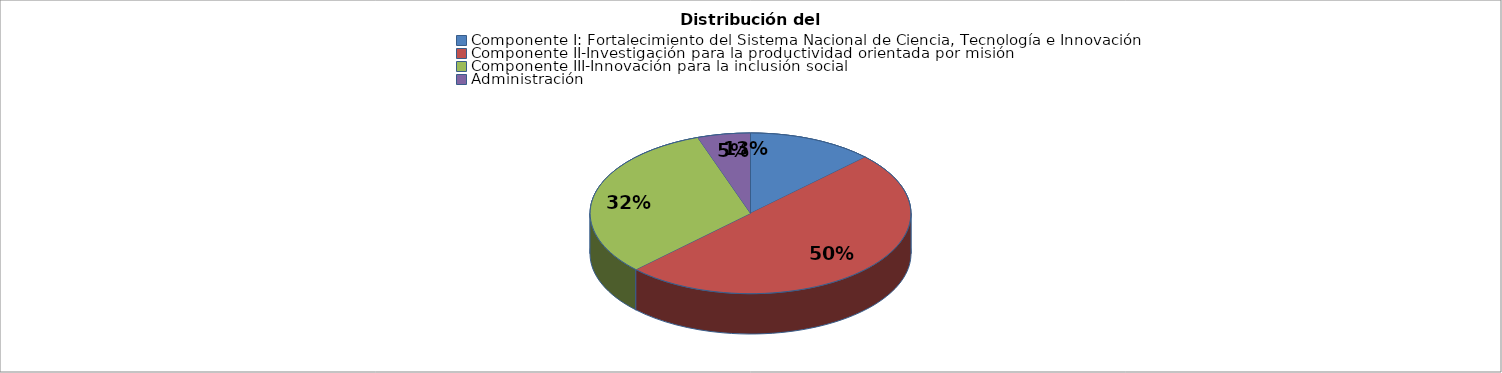
| Category | Series 0 |
|---|---|
| Componente I: Fortalecimiento del Sistema Nacional de Ciencia, Tecnología e Innovación | 5700000 |
| Componente II-Investigación para la productividad orientada por misión | 22500000 |
| Componente III-Innovación para la inclusión social | 14400000 |
| Administración | 2400000 |